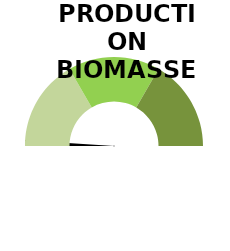
| Category | Series 1 |
|---|---|
| 0 | 0 |
| 1 | 2 |
| 2 | 196 |